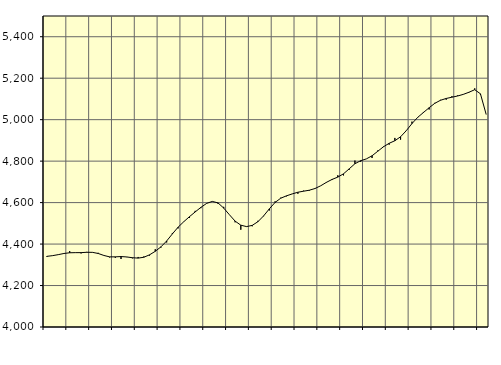
| Category | Piggar | Series 1 |
|---|---|---|
| nan | 4337.9 | 4340.74 |
| 1.0 | 4343.6 | 4344.11 |
| 1.0 | 4349.6 | 4349 |
| 1.0 | 4354.4 | 4354.65 |
| nan | 4366.4 | 4358 |
| 2.0 | 4358 | 4358.6 |
| 2.0 | 4354.8 | 4358.67 |
| 2.0 | 4362.2 | 4360.32 |
| nan | 4359.4 | 4360.01 |
| 3.0 | 4357.8 | 4354.58 |
| 3.0 | 4345.4 | 4345.06 |
| 3.0 | 4335.6 | 4338.28 |
| nan | 4333.7 | 4338.36 |
| 4.0 | 4327.9 | 4339.74 |
| 4.0 | 4337 | 4337.87 |
| 4.0 | 4331.2 | 4334.15 |
| nan | 4337.8 | 4332.28 |
| 5.0 | 4340.1 | 4336.36 |
| 5.0 | 4344.5 | 4348.13 |
| 5.0 | 4375 | 4365.01 |
| nan | 4383 | 4386.64 |
| 6.0 | 4407.7 | 4414.95 |
| 6.0 | 4453.6 | 4448.91 |
| 6.0 | 4475.5 | 4481.27 |
| nan | 4507.2 | 4507.86 |
| 7.0 | 4525.8 | 4532.16 |
| 7.0 | 4560.2 | 4554.89 |
| 7.0 | 4573.2 | 4577.01 |
| nan | 4595.2 | 4596.1 |
| 8.0 | 4606.1 | 4605.71 |
| 8.0 | 4594.6 | 4598.62 |
| 8.0 | 4579.6 | 4573.55 |
| nan | 4541.3 | 4541.46 |
| 9.0 | 4504.9 | 4510.66 |
| 9.0 | 4469.2 | 4491.08 |
| 9.0 | 4485.2 | 4484.22 |
| nan | 4485.8 | 4490.16 |
| 10.0 | 4512.2 | 4507.99 |
| 10.0 | 4534.5 | 4536.05 |
| 10.0 | 4562.1 | 4569.92 |
| nan | 4605.9 | 4600.67 |
| 11.0 | 4623.7 | 4621.21 |
| 11.0 | 4630.2 | 4632.61 |
| 11.0 | 4642.1 | 4641.84 |
| nan | 4642.5 | 4649.99 |
| 12.0 | 4657.7 | 4655 |
| 12.0 | 4657.3 | 4659.69 |
| 12.0 | 4669 | 4667.92 |
| nan | 4680.9 | 4681.06 |
| 13.0 | 4696 | 4697.55 |
| 13.0 | 4708.9 | 4711.82 |
| 13.0 | 4731.9 | 4722.99 |
| nan | 4731.1 | 4738.92 |
| 14.0 | 4758.5 | 4763.01 |
| 14.0 | 4802.8 | 4787.51 |
| 14.0 | 4797 | 4802.02 |
| nan | 4810.7 | 4810.75 |
| 15.0 | 4815 | 4825.81 |
| 15.0 | 4851.3 | 4847.58 |
| 15.0 | 4871.2 | 4869.24 |
| nan | 4879.4 | 4886.01 |
| 16.0 | 4911.9 | 4898.46 |
| 16.0 | 4903.7 | 4917.5 |
| 16.0 | 4945.8 | 4946.91 |
| nan | 4990.5 | 4981.14 |
| 17.0 | 5009.5 | 5011 |
| 17.0 | 5037.2 | 5034.41 |
| 17.0 | 5049.1 | 5057.41 |
| nan | 5081.2 | 5078.93 |
| 18.0 | 5095.6 | 5093.53 |
| 18.0 | 5096.4 | 5102.26 |
| 18.0 | 5113.2 | 5108.3 |
| nan | 5116.8 | 5114.17 |
| 19.0 | 5121.4 | 5122.06 |
| 19.0 | 5133.3 | 5132.33 |
| 19.0 | 5151 | 5144.53 |
| nan | 5120.1 | 5124.67 |
| 20.0 | 5025 | 5025.83 |